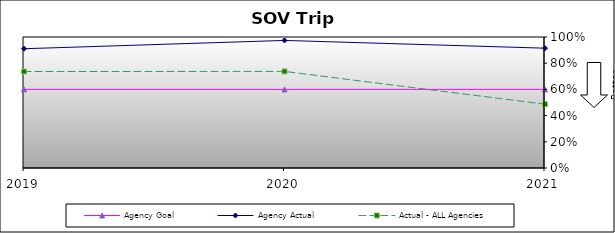
| Category | Agency Goal | Agency Actual | Actual - ALL Agencies |
|---|---|---|---|
| 2019.0 | 0.6 | 0.91 | 0.736 |
| 2020.0 | 0.6 | 0.974 | 0.737 |
| 2021.0 | 0.6 | 0.914 | 0.487 |